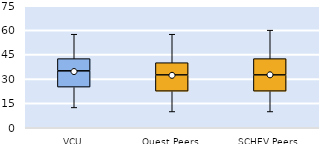
| Category | 25th | 50th | 75th |
|---|---|---|---|
| VCU | 25 | 10 | 7.5 |
| Quest Peers | 22.5 | 10 | 7.5 |
| SCHEV Peers | 22.5 | 10 | 10 |